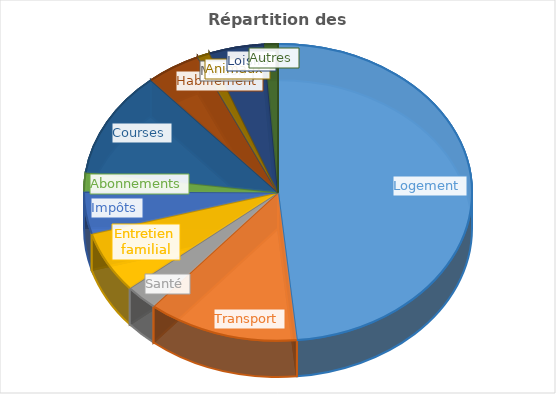
| Category | Series 0 | Series 1 |
|---|---|---|
| Logement |  | 2110 |
| Transport |  | 550 |
| Santé |  | 120 |
| Entretien familial |  | 290 |
| Impôts |  | 200 |
| Abonnements |  | 90 |
| Courses |  | 500 |
| Habillement |  | 200 |
| Maison |  | 0 |
| Animaux |  | 45 |
| Loisirs |  | 200 |
| Autres |  | 50 |